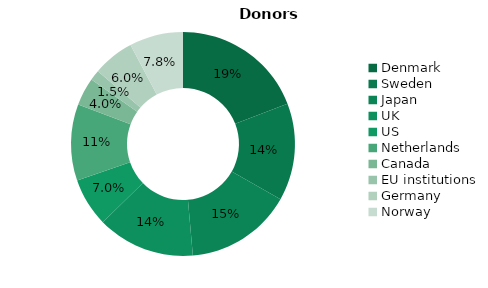
| Category | Series 0 |
|---|---|
| Denmark | 0.191 |
| Sweden | 0.141 |
| Japan | 0.154 |
| UK | 0.141 |
| US | 0.07 |
| Netherlands | 0.11 |
| Canada | 0.04 |
| EU institutions | 0.015 |
| Germany | 0.06 |
| Norway | 0.078 |